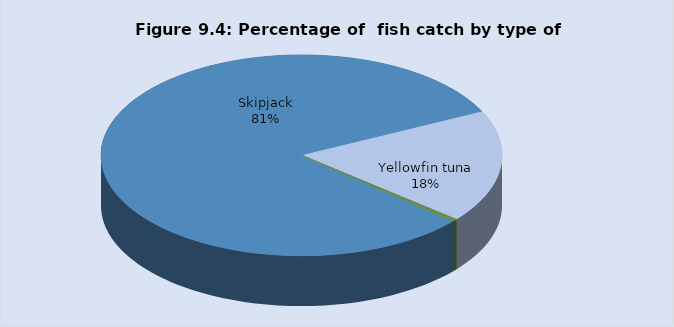
| Category | Series 0 |
|---|---|
| Skipjack | 126385.8 |
| Yellowfin tuna | 28082.963 |
| Bigeye tuna | 223.89 |
| Albacore | 0 |
| Other tuna related species | 58.484 |
| Other Marine Fishes | 454.079 |